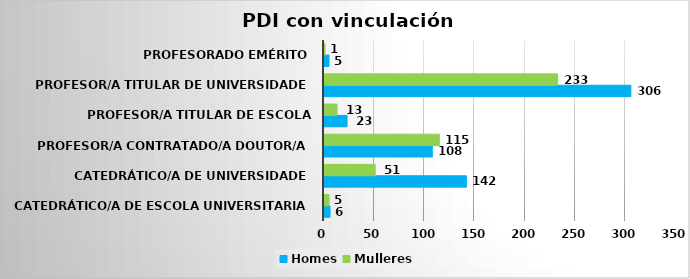
| Category | Homes | Mulleres |
|---|---|---|
| Catedrático/a de Escola Universitaria | 6 | 5 |
| Catedrático/a de Universidade | 142 | 51 |
| Profesor/a contratado/a doutor/a | 108 | 115 |
| Profesor/a titular de Escola Universitaria | 23 | 13 |
| Profesor/a titular de Universidade | 306 | 233 |
| Profesorado emérito | 5 | 1 |